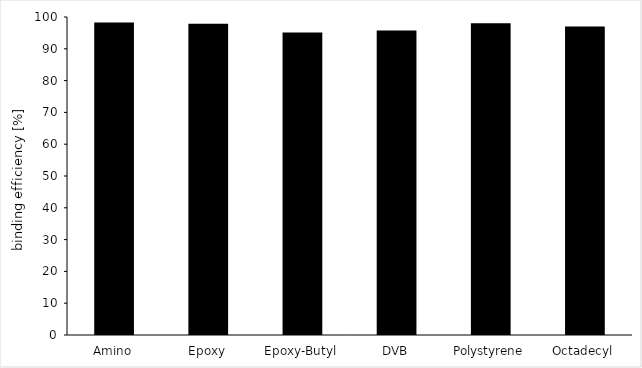
| Category | Series 0 |
|---|---|
| Amino | 98.24 |
| Epoxy | 97.875 |
| Epoxy-Butyl | 95.147 |
| DVB | 95.782 |
| Polystyrene | 98.037 |
| Octadecyl | 97.006 |